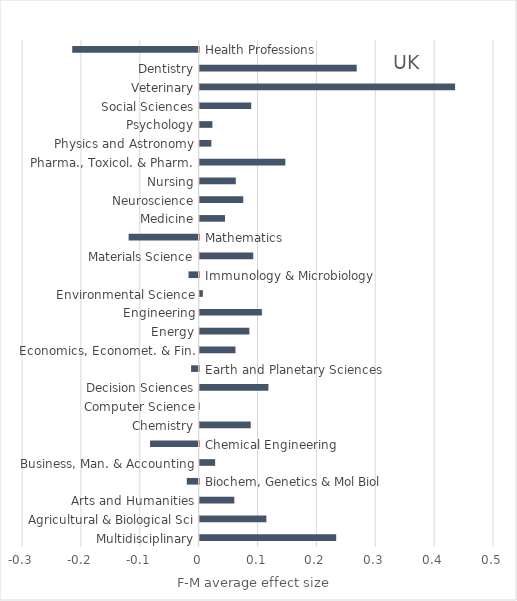
| Category | F-M average effect size | Proportion of years |
|---|---|---|
|  | 0.232 | 0 |
|  | 0.113 | 0 |
|  | 0.059 | 0 |
|  | -0.02 | 0 |
|  | 0.026 | 0 |
|  | -0.083 | 0 |
|  | 0.087 | 0 |
|  | 0 | 0 |
|  | 0.117 | 0 |
|  | -0.013 | 0 |
|  | 0.061 | 0 |
|  | 0.084 | 0 |
|  | 0.106 | 0 |
|  | 0.006 | 0 |
|  | -0.017 | 0 |
|  | 0.091 | 0 |
|  | -0.119 | 0 |
|  | 0.043 | 0 |
|  | 0.074 | 0 |
|  | 0.061 | 0 |
|  | 0.146 | 0 |
|  | 0.02 | 0 |
|  | 0.022 | 0 |
|  | 0.088 | 0 |
|  | 0.434 | 0 |
|  | 0.267 | 0 |
|  | -0.215 | 0 |